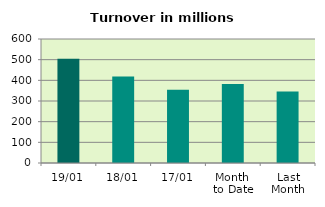
| Category | Series 0 |
|---|---|
| 19/01 | 504.148 |
| 18/01 | 418.687 |
| 17/01 | 354.479 |
| Month 
to Date | 381.689 |
| Last
Month | 346.191 |